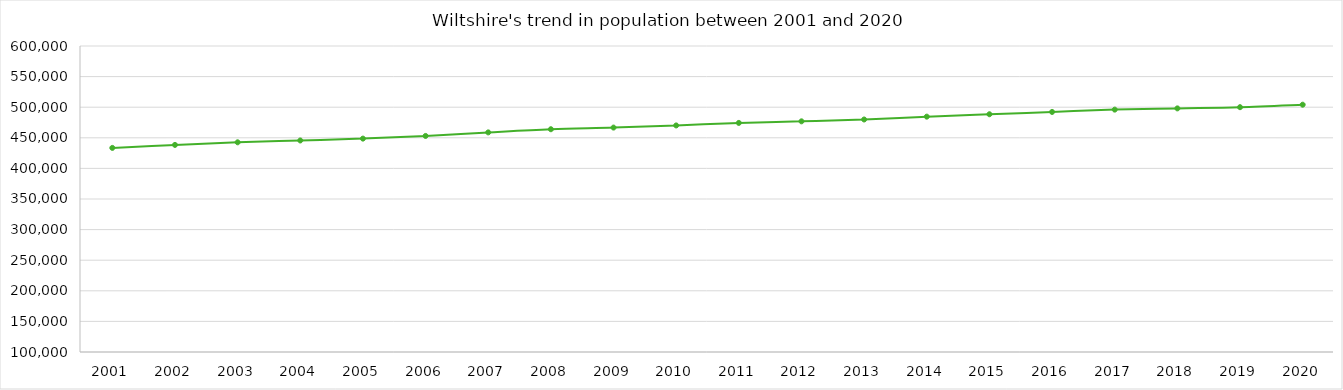
| Category | Total |
|---|---|
| 2001.0 | 433508 |
| 2002.0 | 438386 |
| 2003.0 | 442633 |
| 2004.0 | 445632 |
| 2005.0 | 448670 |
| 2006.0 | 453041 |
| 2007.0 | 458840 |
| 2008.0 | 464007 |
| 2009.0 | 466711 |
| 2010.0 | 470199 |
| 2011.0 | 474319 |
| 2012.0 | 476914 |
| 2013.0 | 479911 |
| 2014.0 | 484560 |
| 2015.0 | 488487 |
| 2016.0 | 492240 |
| 2017.0 | 496043 |
| 2018.0 | 498064 |
| 2019.0 | 500024 |
| 2020.0 | 504070 |